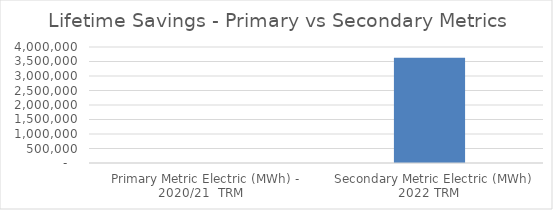
| Category | Series 0 |
|---|---|
| Primary Metric Electric (MWh) - 2020/21  TRM | 0 |
| Secondary Metric Electric (MWh) 2022 TRM | 3625802.11 |